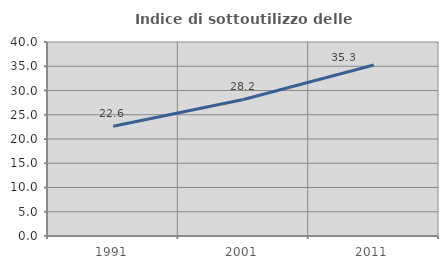
| Category | Indice di sottoutilizzo delle abitazioni  |
|---|---|
| 1991.0 | 22.61 |
| 2001.0 | 28.152 |
| 2011.0 | 35.264 |